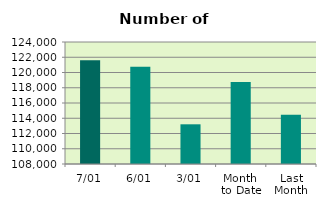
| Category | Series 0 |
|---|---|
| 7/01 | 121618 |
| 6/01 | 120738 |
| 3/01 | 113206 |
| Month 
to Date | 118744.5 |
| Last
Month | 114459.3 |